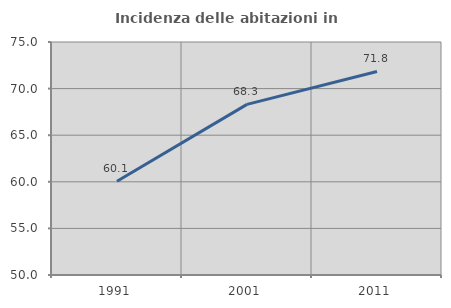
| Category | Incidenza delle abitazioni in proprietà  |
|---|---|
| 1991.0 | 60.051 |
| 2001.0 | 68.307 |
| 2011.0 | 71.835 |